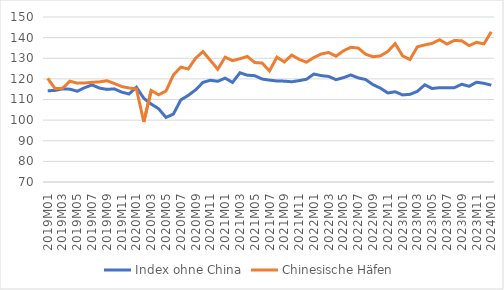
| Category | Index ohne China | Chinesische Häfen |
|---|---|---|
| 2019M01 | 114.215 | 120.26 |
| 2019M02 | 114.411 | 115.286 |
| 2019M03 | 115.152 | 115.412 |
| 2019M04 | 115.008 | 118.872 |
| 2019M05 | 114.02 | 117.927 |
| 2019M06 | 115.732 | 118.025 |
| 2019M07 | 117.06 | 118.336 |
| 2019M08 | 115.531 | 118.551 |
| 2019M09 | 114.9 | 119.097 |
| 2019M10 | 115.155 | 117.792 |
| 2019M11 | 113.582 | 116.294 |
| 2019M12 | 112.664 | 115.59 |
| 2020M01 | 115.95 | 115.099 |
| 2020M02 | 110.586 | 99.143 |
| 2020M03 | 107.781 | 114.383 |
| 2020M04 | 105.525 | 112.268 |
| 2020M05 | 101.305 | 114.079 |
| 2020M06 | 102.913 | 121.882 |
| 2020M07 | 109.778 | 125.696 |
| 2020M08 | 111.97 | 124.773 |
| 2020M09 | 114.65 | 129.981 |
| 2020M10 | 118.302 | 133.241 |
| 2020M11 | 119.33 | 128.974 |
| 2020M12 | 118.836 | 124.671 |
| 2021M01 | 120.354 | 130.525 |
| 2021M02 | 118.271 | 128.825 |
| 2021M03 | 122.961 | 129.764 |
| 2021M04 | 121.788 | 130.882 |
| 2021M05 | 121.557 | 127.927 |
| 2021M06 | 119.927 | 127.666 |
| 2021M07 | 119.393 | 123.852 |
| 2021M08 | 118.987 | 130.548 |
| 2021M09 | 118.894 | 128.199 |
| 2021M10 | 118.599 | 131.541 |
| 2021M11 | 119.14 | 129.473 |
| 2021M12 | 119.813 | 128.077 |
| 2022M01 | 122.353 | 130.342 |
| 2022M02 | 121.588 | 132.06 |
| 2022M03 | 121.184 | 132.809 |
| 2022M04 | 119.609 | 130.965 |
| 2022M05 | 120.589 | 133.617 |
| 2022M06 | 121.9 | 135.3 |
| 2022M07 | 120.475 | 134.948 |
| 2022M08 | 119.691 | 131.947 |
| 2022M09 | 117.197 | 130.734 |
| 2022M10 | 115.512 | 131.139 |
| 2022M11 | 113.156 | 133.305 |
| 2022M12 | 113.755 | 137.086 |
| 2023M01 | 112.221 | 131.188 |
| 2023M02 | 112.506 | 129.372 |
| 2023M03 | 113.944 | 135.565 |
| 2023M04 | 117.122 | 136.456 |
| 2023M05 | 115.337 | 137.2 |
| 2023M06 | 115.734 | 138.978 |
| 2023M07 | 115.756 | 136.883 |
| 2023M08 | 115.729 | 138.619 |
| 2023M09 | 117.409 | 138.464 |
| 2023M10 | 116.395 | 136.13 |
| 2023M11 | 118.382 | 137.713 |
| 2023M12 | 117.845 | 136.964 |
| 2024M01 | 116.94 | 142.826 |